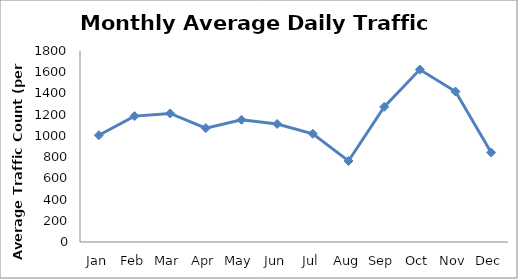
| Category | Series 0 |
|---|---|
| Jan | 1006.25 |
| Feb | 1186.25 |
| Mar | 1211.75 |
| Apr | 1073.25 |
| May | 1152 |
| Jun | 1112.5 |
| Jul | 1019.5 |
| Aug | 763.75 |
| Sep | 1273.25 |
| Oct | 1625 |
| Nov | 1418 |
| Dec | 843.5 |